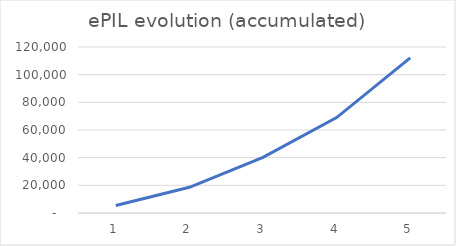
| Category | ePIL evolution (accumulated) |
|---|---|
| 0 | 5400 |
| 1 | 18600 |
| 2 | 40200 |
| 3 | 69000 |
| 4 | 112200 |